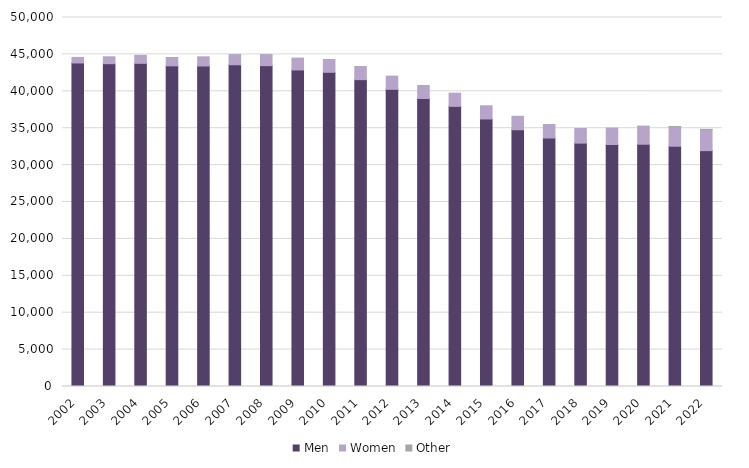
| Category | Men | Women | Other |
|---|---|---|---|
| 2002.0 | 43841 | 753 | 0 |
| 2003.0 | 43741 | 938 | 0 |
| 2004.0 | 43790 | 1081 | 0 |
| 2005.0 | 43450 | 1132 | 0 |
| 2006.0 | 43432 | 1239 | 0 |
| 2007.0 | 43596 | 1382 | 0 |
| 2008.0 | 43476 | 1502 | 0 |
| 2009.0 | 42893 | 1605 | 0 |
| 2010.0 | 42574 | 1733 | 0 |
| 2011.0 | 41579 | 1778 | 0 |
| 2012.0 | 40268 | 1790 | 0 |
| 2013.0 | 39028 | 1755 | 0 |
| 2014.0 | 37961 | 1787 | 0 |
| 2015.0 | 36251 | 1787 | 0 |
| 2016.0 | 34789 | 1824 | 0 |
| 2017.0 | 33672 | 1833 | 0 |
| 2018.0 | 32978 | 1980 | 0 |
| 2019.0 | 32790 | 2231 | 0 |
| 2020.0 | 32828 | 2461 | 0 |
| 2021.0 | 32558 | 2644 | 15 |
| 2022.0 | 31960 | 2862 | 26 |